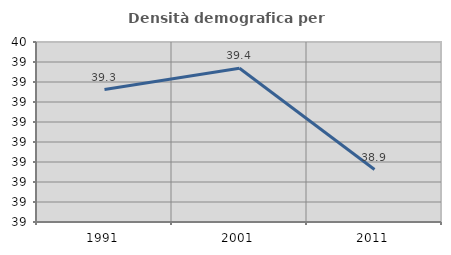
| Category | Densità demografica |
|---|---|
| 1991.0 | 39.262 |
| 2001.0 | 39.369 |
| 2011.0 | 38.862 |